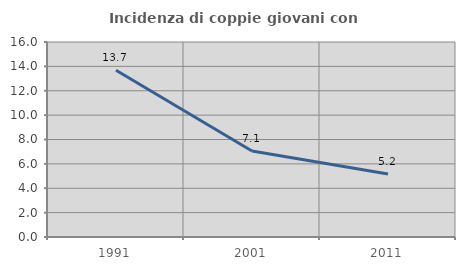
| Category | Incidenza di coppie giovani con figli |
|---|---|
| 1991.0 | 13.679 |
| 2001.0 | 7.05 |
| 2011.0 | 5.161 |